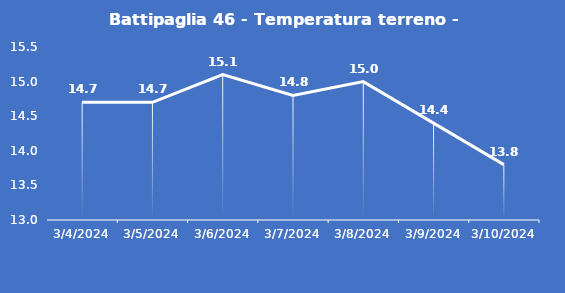
| Category | Battipaglia 46 - Temperatura terreno - Max (°C) |
|---|---|
| 3/4/24 | 14.7 |
| 3/5/24 | 14.7 |
| 3/6/24 | 15.1 |
| 3/7/24 | 14.8 |
| 3/8/24 | 15 |
| 3/9/24 | 14.4 |
| 3/10/24 | 13.8 |